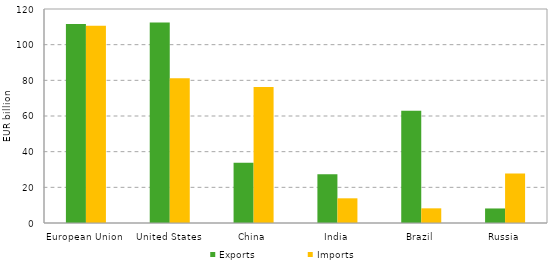
| Category | Exports | Imports |
|---|---|---|
| European Union | 111.623 | 110.663 |
| United States | 112.461 | 81.19 |
| China | 33.788 | 76.316 |
| India | 27.283 | 13.843 |
| Brazil | 62.887 | 8.226 |
| Russia | 8.15 | 27.796 |